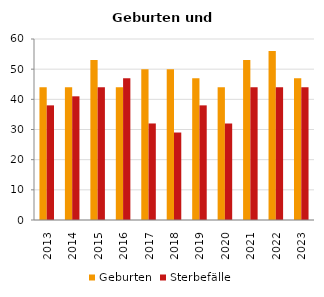
| Category | Geburten | Sterbefälle |
|---|---|---|
| 2013.0 | 44 | 38 |
| 2014.0 | 44 | 41 |
| 2015.0 | 53 | 44 |
| 2016.0 | 44 | 47 |
| 2017.0 | 50 | 32 |
| 2018.0 | 50 | 29 |
| 2019.0 | 47 | 38 |
| 2020.0 | 44 | 32 |
| 2021.0 | 53 | 44 |
| 2022.0 | 56 | 44 |
| 2023.0 | 47 | 44 |